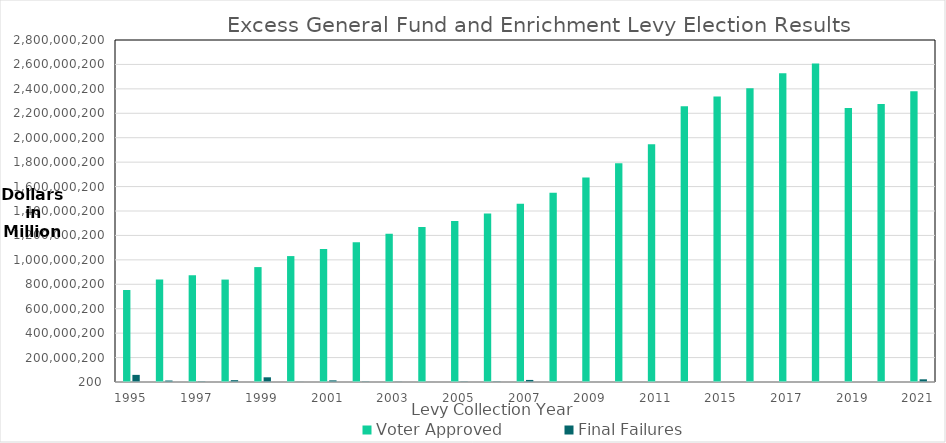
| Category | Voter Approved | Final Failures |
|---|---|---|
| 1995 | 753041982 | 58324310 |
| 1996 | 839318107 | 12089175 |
| 1997 | 874789668 | 3765443 |
| 1998 | 838604584 | 15047453 |
| 1999 | 940765937 | 38481902 |
| 2000 | 1030873759 | 1268399 |
| 2001 | 1088088126 | 13438599 |
| 2002 | 1143919081 | 3533559 |
| 2003 | 1212816864 | 1907738 |
| 2004 | 1268819341 | 482851 |
| 2005 | 1317841524 | 3338000 |
| 2006 | 1380248875 | 3947759 |
| 2007 | 1459700998 | 16940636 |
| 2008 | 1549670919 | 225000 |
| 2009 | 1674487111 | 347952 |
| 2010 | 1791463918 | 349181 |
| 2011 | 1945703236 | 0 |
| 2014 | 2257657771 | 0 |
| 2015 | 2338026390 | 117000 |
| 2016 | 2405746819 | 117000 |
| 2017 | 2527706168 | 0 |
| 2018 | 2606634102 | 0 |
| 2019 | 2243795589 | 0 |
| 2020 | 2276315760 | 0 |
| 2021 | 2380406000 | 22016023 |